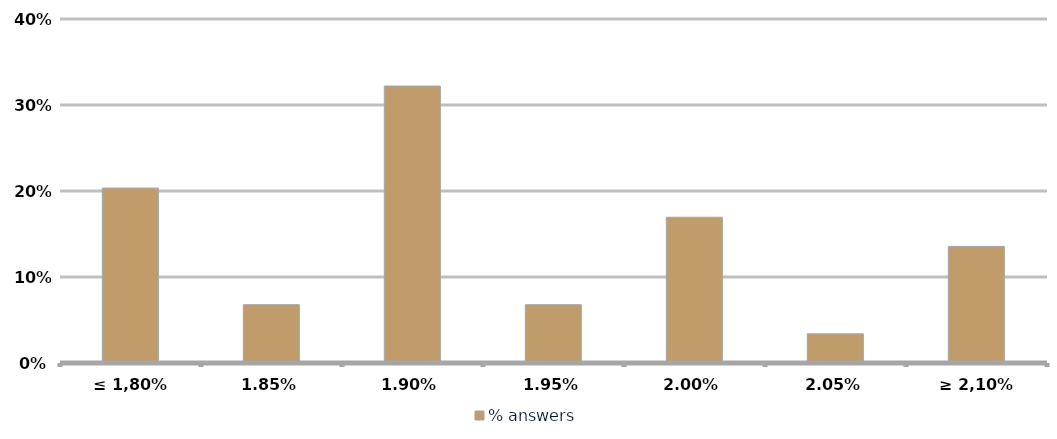
| Category | % answers |
|---|---|
| ≤ 1,80% | 0.203 |
| 1,85% | 0.068 |
| 1,90% | 0.322 |
| 1,95% | 0.068 |
| 2,00% | 0.169 |
| 2,05% | 0.034 |
| ≥ 2,10% | 0.136 |